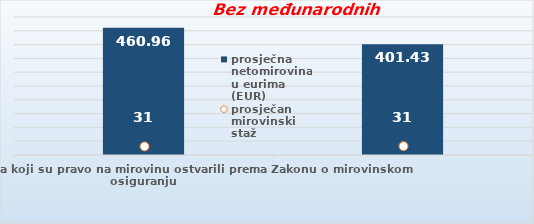
| Category | prosječna netomirovina u eurima (EUR) |
|---|---|
| Korisnici mirovina koji su pravo na mirovinu ostvarili prema Zakonu o mirovinskom osiguranju  | 460.96 |
| Korisnici koji su pravo na mirovinu PRVI PUT ostvarili u 2023. godini prema Zakonu o mirovinskom osiguranju - NOVI KORISNICI | 401.426 |